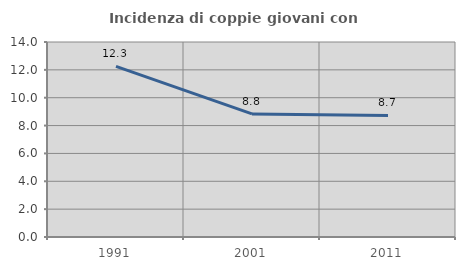
| Category | Incidenza di coppie giovani con figli |
|---|---|
| 1991.0 | 12.256 |
| 2001.0 | 8.836 |
| 2011.0 | 8.729 |